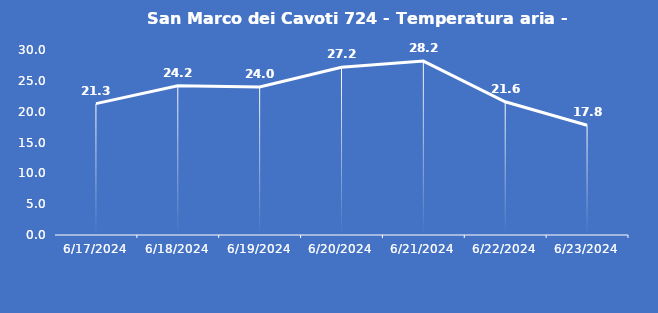
| Category | San Marco dei Cavoti 724 - Temperatura aria - Grezzo (°C) |
|---|---|
| 6/17/24 | 21.3 |
| 6/18/24 | 24.2 |
| 6/19/24 | 24 |
| 6/20/24 | 27.2 |
| 6/21/24 | 28.2 |
| 6/22/24 | 21.6 |
| 6/23/24 | 17.8 |